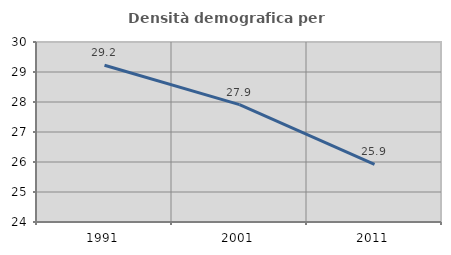
| Category | Densità demografica |
|---|---|
| 1991.0 | 29.226 |
| 2001.0 | 27.911 |
| 2011.0 | 25.92 |